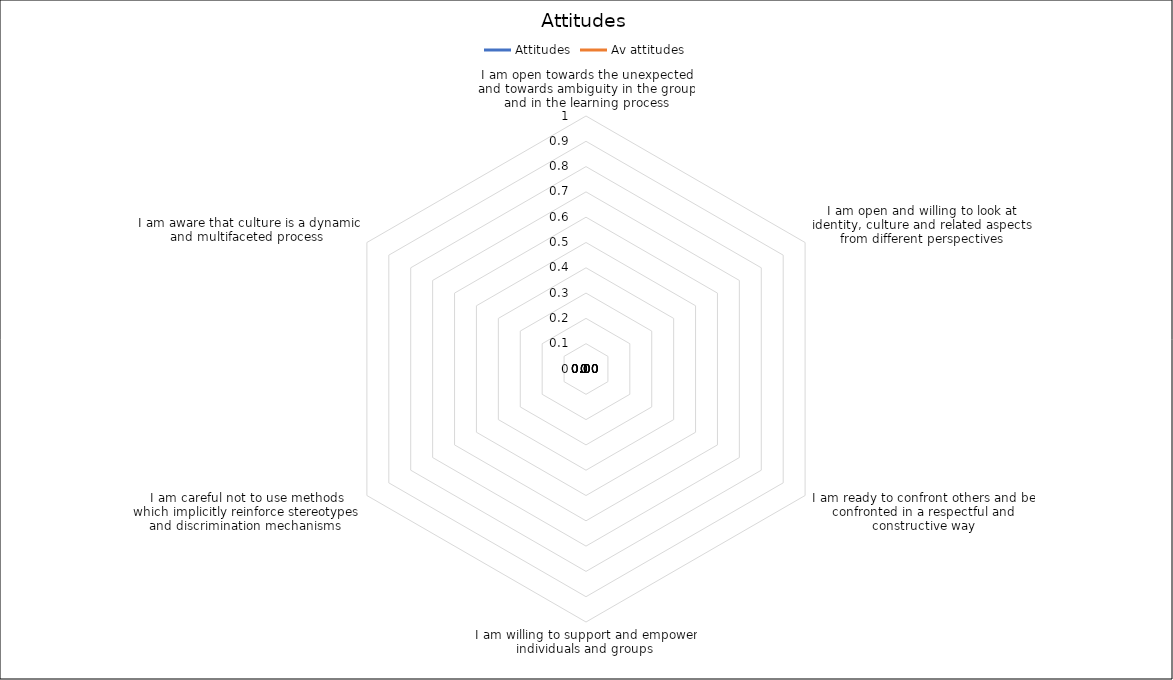
| Category | Attitudes | Av attitudes |
|---|---|---|
| I am open towards the unexpected and towards ambiguity in the group and in the learning process | 0 | 0 |
| I am open and willing to look at identity, culture and related aspects from different perspectives | 0 | 0 |
| I am ready to confront others and be confronted in a respectful and constructive way | 0 | 0 |
| I am willing to support and empower individuals and groups  | 0 | 0 |
| I am careful not to use methods which implicitly reinforce stereotypes and discrimination mechanisms  | 0 | 0 |
| I am aware that culture is a dynamic and multifaceted process  | 0 | 0 |